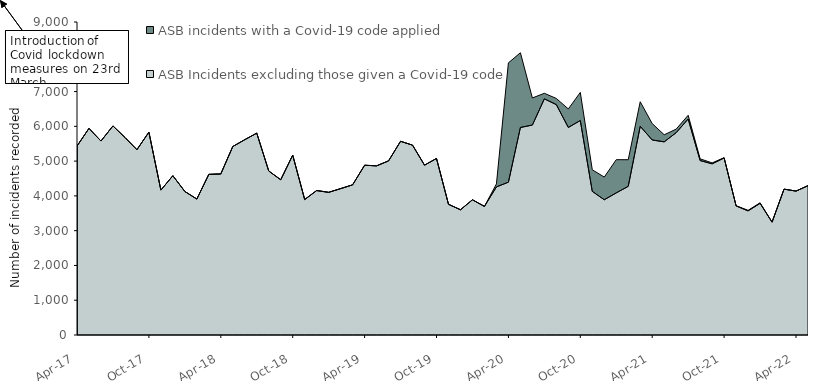
| Category | ASB Incidents excluding those given a Covid-19 code | ASB incidents with a Covid-19 code applied |
|---|---|---|
| 2017-04-01 | 5433 | 0 |
| 2017-05-01 | 5941 | 0 |
| 2017-06-01 | 5577 | 0 |
| 2017-07-01 | 6012 | 0 |
| 2017-08-01 | 5681 | 0 |
| 2017-09-01 | 5329 | 0 |
| 2017-10-01 | 5832 | 0 |
| 2017-11-01 | 4167 | 0 |
| 2017-12-01 | 4580 | 0 |
| 2018-01-01 | 4127 | 0 |
| 2018-02-01 | 3909 | 0 |
| 2018-03-01 | 4619 | 0 |
| 2018-04-01 | 4631 | 0 |
| 2018-05-01 | 5420 | 0 |
| 2018-06-01 | 5616 | 0 |
| 2018-07-01 | 5805 | 0 |
| 2018-08-01 | 4716 | 0 |
| 2018-09-01 | 4464 | 0 |
| 2018-10-01 | 5172 | 0 |
| 2018-11-01 | 3896 | 0 |
| 2018-12-01 | 4154 | 0 |
| 2019-01-01 | 4102 | 0 |
| 2019-02-01 | 4209 | 0 |
| 2019-03-01 | 4318 | 0 |
| 2019-04-01 | 4881 | 0 |
| 2019-05-01 | 4864 | 0 |
| 2019-06-01 | 5007 | 0 |
| 2019-07-01 | 5570 | 0 |
| 2019-08-01 | 5459 | 0 |
| 2019-09-01 | 4884 | 0 |
| 2019-10-01 | 5076 | 0 |
| 2019-11-01 | 3759 | 0 |
| 2019-12-01 | 3601 | 0 |
| 2020-01-01 | 3888 | 0 |
| 2020-02-01 | 3698 | 0 |
| 2020-03-01 | 4258 | 86 |
| 2020-04-01 | 4394 | 3431 |
| 2020-05-01 | 5967 | 2149 |
| 2020-06-01 | 6037 | 779 |
| 2020-07-01 | 6791 | 159 |
| 2020-08-01 | 6624 | 177 |
| 2020-09-01 | 5968 | 532 |
| 2020-10-01 | 6167 | 808 |
| 2020-11-01 | 4130 | 621 |
| 2020-12-01 | 3889 | 652 |
| 2021-01-01 | 4086 | 955 |
| 2021-02-01 | 4275 | 765 |
| 2021-03-01 | 6001 | 706 |
| 2021-04-01 | 5608 | 471 |
| 2021-05-01 | 5554 | 203 |
| 2021-06-01 | 5818 | 102 |
| 2021-07-01 | 6211 | 107 |
| 2021-08-01 | 5016 | 49 |
| 2021-09-01 | 4922 | 27 |
| 2021-10-01 | 5090 | 9 |
| 2021-11-01 | 3712 | 5 |
| 2021-12-01 | 3569 | 16 |
| 2022-01-01 | 3786 | 16 |
| 2022-02-01 | 3245 | 1 |
| 2022-03-01 | 4194 | 1 |
| 2022-04-01 | 4138 | 0 |
| 2022-05-01 | 4294 | 0 |